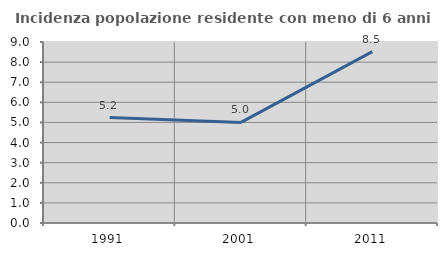
| Category | Incidenza popolazione residente con meno di 6 anni |
|---|---|
| 1991.0 | 5.246 |
| 2001.0 | 5 |
| 2011.0 | 8.518 |